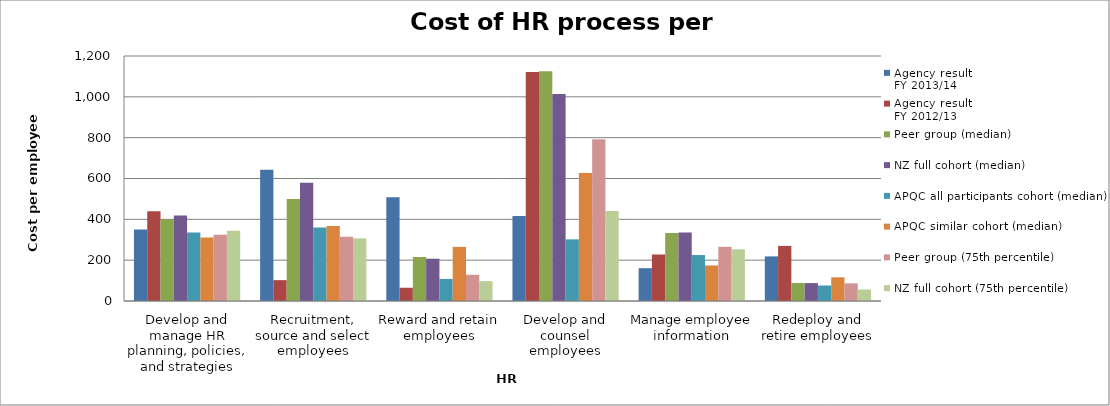
| Category | Agency result
FY 2013/14 | Agency result
FY 2012/13 | Peer group (median) | NZ full cohort (median) | APQC all participants cohort (median) | APQC similar cohort (median) | Peer group (75th percentile) | NZ full cohort (75th percentile) |
|---|---|---|---|---|---|---|---|---|
| Develop and manage HR planning, policies, and strategies | 350.595 | 439.303 | 400.171 | 419.297 | 335 | 311 | 324.879 | 343.721 |
| Recruitment, source and select employees | 643.452 | 102.164 | 499.536 | 579.597 | 360 | 367 | 314.152 | 306.952 |
| Reward and retain employees | 508.333 | 64.904 | 215.389 | 207.113 | 108 | 265 | 128.356 | 97.25 |
| Develop and counsel employees | 416.667 | 1121.995 | 1125.909 | 1013.935 | 302 | 627 | 791.771 | 440.663 |
| Manage employee information | 160.714 | 227.764 | 332.953 | 335.541 | 225 | 174 | 265.437 | 253.136 |
| Redeploy and retire employees | 218.452 | 269.832 | 88.351 | 87.739 | 76 | 116 | 86.498 | 56.302 |